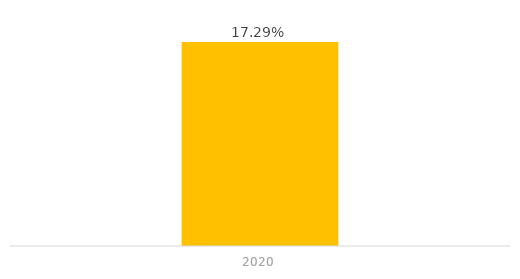
| Category | Series 0 |
|---|---|
| 2020.0 | 0.173 |